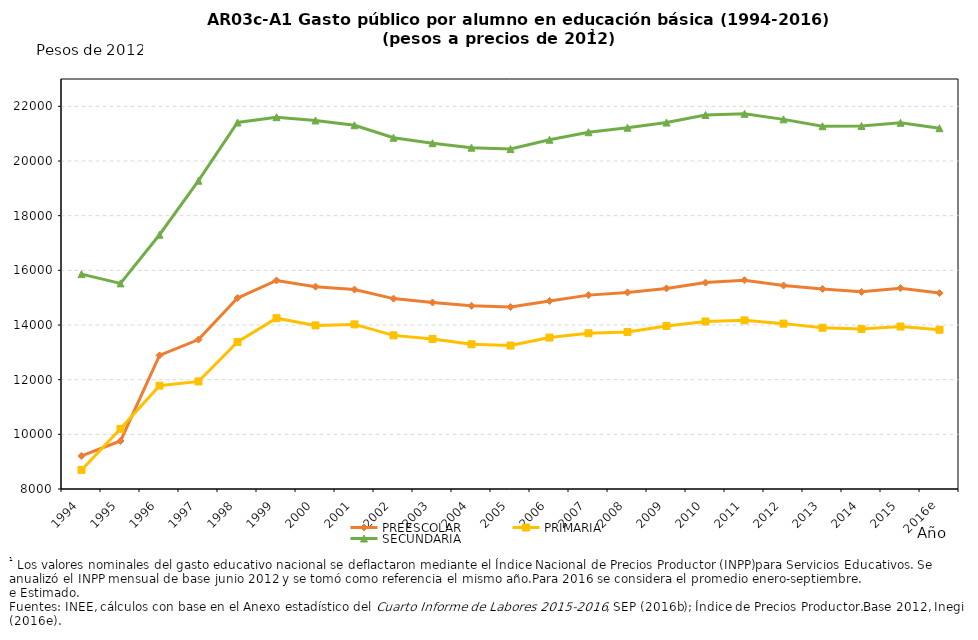
| Category | PREESCOLAR | PRIMARIA | SECUNDARIA |
|---|---|---|---|
| 1994 | 9209.904 | 8698.243 | 15861.502 |
| 1995 | 9756.963 | 10200.461 | 15522.44 |
| 1996 | 12885.03 | 11780.599 | 17302.754 |
| 1997 | 13465.555 | 11935.378 | 19280.227 |
| 1998 | 14985.799 | 13380.177 | 21408.284 |
| 1999 | 15628.354 | 14249.381 | 21603.901 |
| 2000 | 15403.212 | 13984.495 | 21483.427 |
| 2001 | 15297.255 | 14022.484 | 21306.891 |
| 2002 | 14965.295 | 13620.1 | 20850.524 |
| 2003 | 14823.264 | 13490.907 | 20651.538 |
| 2004 | 14700.843 | 13293.316 | 20487.345 |
| 2005 | 14657.791 | 13248.388 | 20436.343 |
| 2006 | 14879.54 | 13539.041 | 20777.735 |
| 2007 | 15092.978 | 13697.829 | 21054.071 |
| 2008 | 15190.402 | 13743.697 | 21218.34 |
| 2009 | 15339.502 | 13965.815 | 21406.618 |
| 2010 | 15550.785 | 14127.122 | 21683.489 |
| 2011 | 15638.664 | 14169.26 | 21726.198 |
| 2012 | 15445.056 | 14050.019 | 21523.433 |
| 2013 | 15316.465 | 13898.274 | 21272.868 |
| 2014 | 15213.796 | 13855.421 | 21281.202 |
| 2015 | 15347.105 | 13943.941 | 21398.249 |
| 2016e | 15166.611 | 13825.917 | 21199.739 |